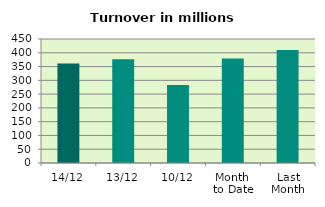
| Category | Series 0 |
|---|---|
| 14/12 | 361.051 |
| 13/12 | 376.133 |
| 10/12 | 282.619 |
| Month 
to Date | 379.612 |
| Last
Month | 410.338 |